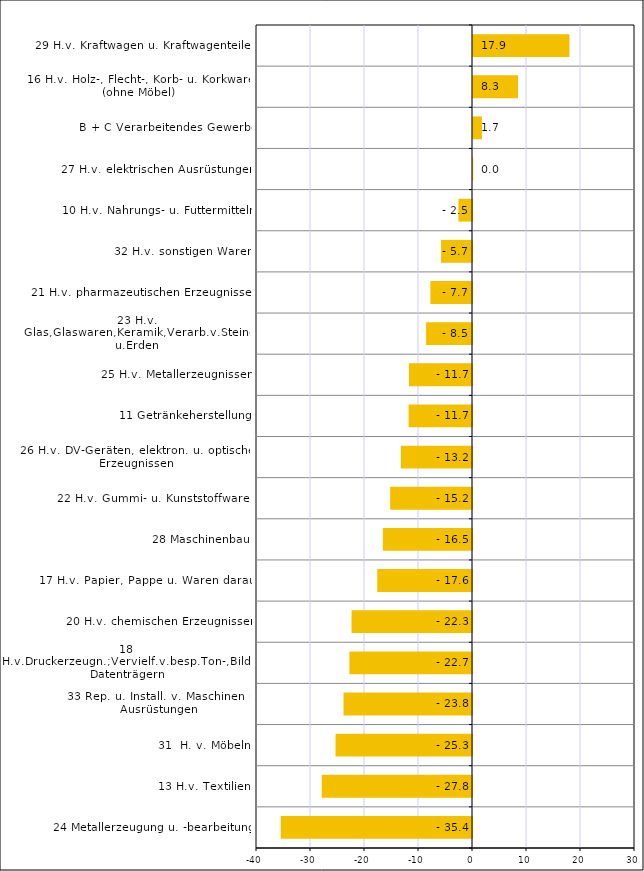
| Category | Series 0 |
|---|---|
| 24 Metallerzeugung u. -bearbeitung | -35.421 |
| 13 H.v. Textilien | -27.825 |
| 31  H. v. Möbeln | -25.27 |
| 33 Rep. u. Install. v. Maschinen u. Ausrüstungen | -23.796 |
| 18 H.v.Druckerzeugn.;Vervielf.v.besp.Ton-,Bild-u.Datenträgern | -22.697 |
| 20 H.v. chemischen Erzeugnissen | -22.302 |
| 17 H.v. Papier, Pappe u. Waren daraus | -17.552 |
| 28 Maschinenbau | -16.502 |
| 22 H.v. Gummi- u. Kunststoffwaren | -15.157 |
| 26 H.v. DV-Geräten, elektron. u. optischen Erzeugnissen | -13.177 |
| 11 Getränkeherstellung | -11.746 |
| 25 H.v. Metallerzeugnissen | -11.685 |
| 23 H.v. Glas,Glaswaren,Keramik,Verarb.v.Steinen u.Erden | -8.507 |
| 21 H.v. pharmazeutischen Erzeugnissen | -7.705 |
| 32 H.v. sonstigen Waren | -5.723 |
| 10 H.v. Nahrungs- u. Futtermitteln | -2.513 |
| 27 H.v. elektrischen Ausrüstungen | 0.036 |
| B + C Verarbeitendes Gewerbe | 1.652 |
| 16 H.v. Holz-, Flecht-, Korb- u. Korkwaren (ohne Möbel) | 8.34 |
| 29 H.v. Kraftwagen u. Kraftwagenteilen | 17.864 |